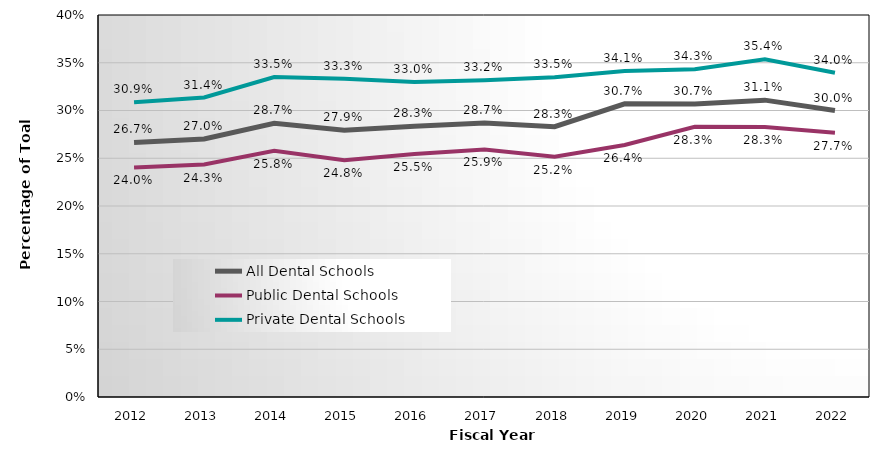
| Category | All Dental Schools | Public Dental Schools | Private Dental Schools |
|---|---|---|---|
| 2012.0 | 0.267 | 0.24 | 0.309 |
| 2013.0 | 0.27 | 0.243 | 0.314 |
| 2014.0 | 0.287 | 0.258 | 0.335 |
| 2015.0 | 0.279 | 0.248 | 0.333 |
| 2016.0 | 0.283 | 0.255 | 0.33 |
| 2017.0 | 0.287 | 0.259 | 0.332 |
| 2018.0 | 0.283 | 0.252 | 0.335 |
| 2019.0 | 0.307 | 0.264 | 0.341 |
| 2020.0 | 0.307 | 0.283 | 0.343 |
| 2021.0 | 0.311 | 0.283 | 0.354 |
| 2022.0 | 0.3 | 0.277 | 0.34 |